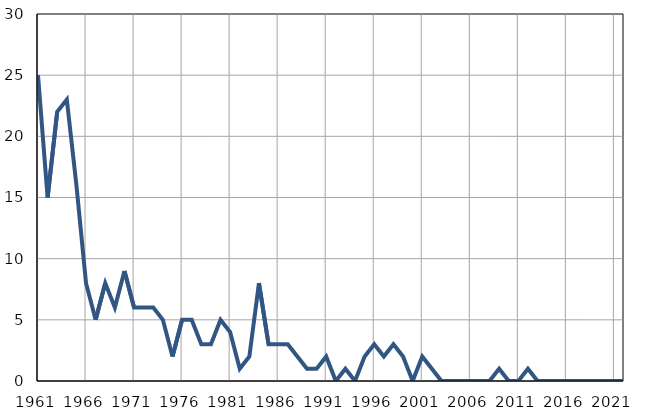
| Category | Infants
deaths |
|---|---|
| 1961.0 | 25 |
| 1962.0 | 15 |
| 1963.0 | 22 |
| 1964.0 | 23 |
| 1965.0 | 16 |
| 1966.0 | 8 |
| 1967.0 | 5 |
| 1968.0 | 8 |
| 1969.0 | 6 |
| 1970.0 | 9 |
| 1971.0 | 6 |
| 1972.0 | 6 |
| 1973.0 | 6 |
| 1974.0 | 5 |
| 1975.0 | 2 |
| 1976.0 | 5 |
| 1977.0 | 5 |
| 1978.0 | 3 |
| 1979.0 | 3 |
| 1980.0 | 5 |
| 1981.0 | 4 |
| 1982.0 | 1 |
| 1983.0 | 2 |
| 1984.0 | 8 |
| 1985.0 | 3 |
| 1986.0 | 3 |
| 1987.0 | 3 |
| 1988.0 | 2 |
| 1989.0 | 1 |
| 1990.0 | 1 |
| 1991.0 | 2 |
| 1992.0 | 0 |
| 1993.0 | 1 |
| 1994.0 | 0 |
| 1995.0 | 2 |
| 1996.0 | 3 |
| 1997.0 | 2 |
| 1998.0 | 3 |
| 1999.0 | 2 |
| 2000.0 | 0 |
| 2001.0 | 2 |
| 2002.0 | 1 |
| 2003.0 | 0 |
| 2004.0 | 0 |
| 2005.0 | 0 |
| 2006.0 | 0 |
| 2007.0 | 0 |
| 2008.0 | 0 |
| 2009.0 | 1 |
| 2010.0 | 0 |
| 2011.0 | 0 |
| 2012.0 | 1 |
| 2013.0 | 0 |
| 2014.0 | 0 |
| 2015.0 | 0 |
| 2016.0 | 0 |
| 2017.0 | 0 |
| 2018.0 | 0 |
| 2019.0 | 0 |
| 2020.0 | 0 |
| 2021.0 | 0 |
| 2022.0 | 0 |